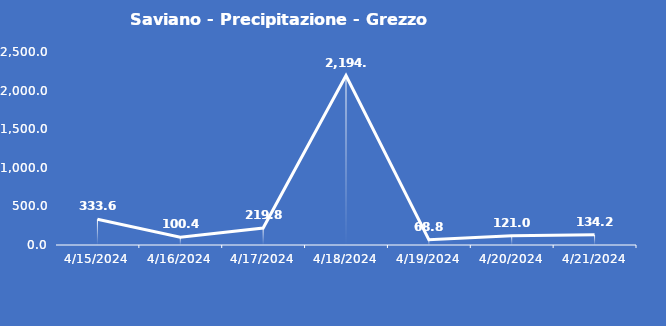
| Category | Saviano - Precipitazione - Grezzo (mm) |
|---|---|
| 4/15/24 | 333.6 |
| 4/16/24 | 100.4 |
| 4/17/24 | 219.8 |
| 4/18/24 | 2194.8 |
| 4/19/24 | 68.8 |
| 4/20/24 | 121 |
| 4/21/24 | 134.2 |